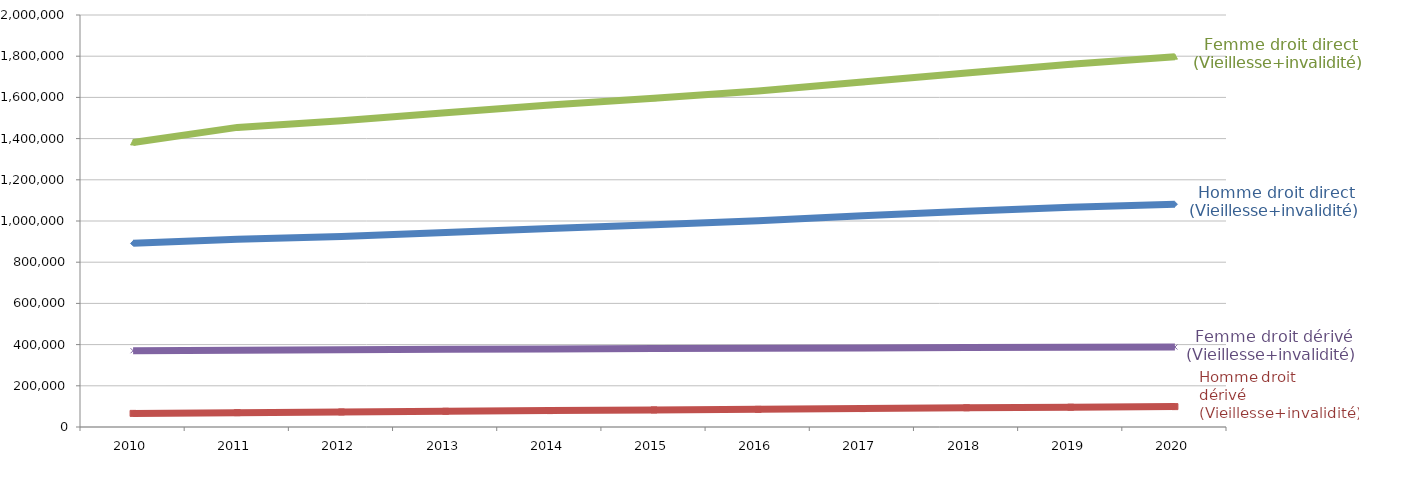
| Category | Homme droit direct (Vieillesse+invalidité) | Femme droit direct (Vieillesse+invalidité) | Femme droit dérivé (Vieillesse+invalidité) | Homme droit dérivé (Vieillesse+invalidité) |
|---|---|---|---|---|
| 2010.0 | 891443 | 1381215 | 370258 | 66096 |
| 2011.0 | 911902 | 1454337 | 373127 | 69622 |
| 2012.0 | 924280 | 1486319 | 375013 | 73017 |
| 2013.0 | 944579 | 1525461 | 376963 | 76396 |
| 2014.0 | 963675 | 1562572 | 378673 | 79640 |
| 2015.0 | 981204 | 1596159 | 380690 | 82868 |
| 2016.0 | 1000797 | 1631317 | 381714 | 85727 |
| 2017.0 | 1025294 | 1674238 | 383550 | 89368 |
| 2018.0 | 1046925 | 1718402 | 386350 | 93238 |
| 2019.0 | 1066844 | 1760645 | 387199 | 96183 |
| 2020.0 | 1081539 | 1797721 | 388185 | 98935 |